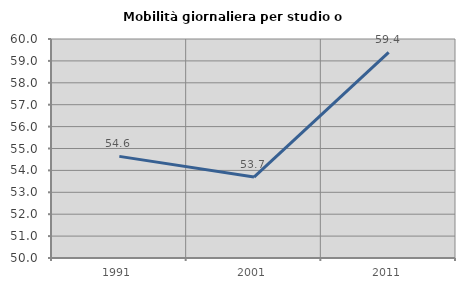
| Category | Mobilità giornaliera per studio o lavoro |
|---|---|
| 1991.0 | 54.641 |
| 2001.0 | 53.697 |
| 2011.0 | 59.392 |